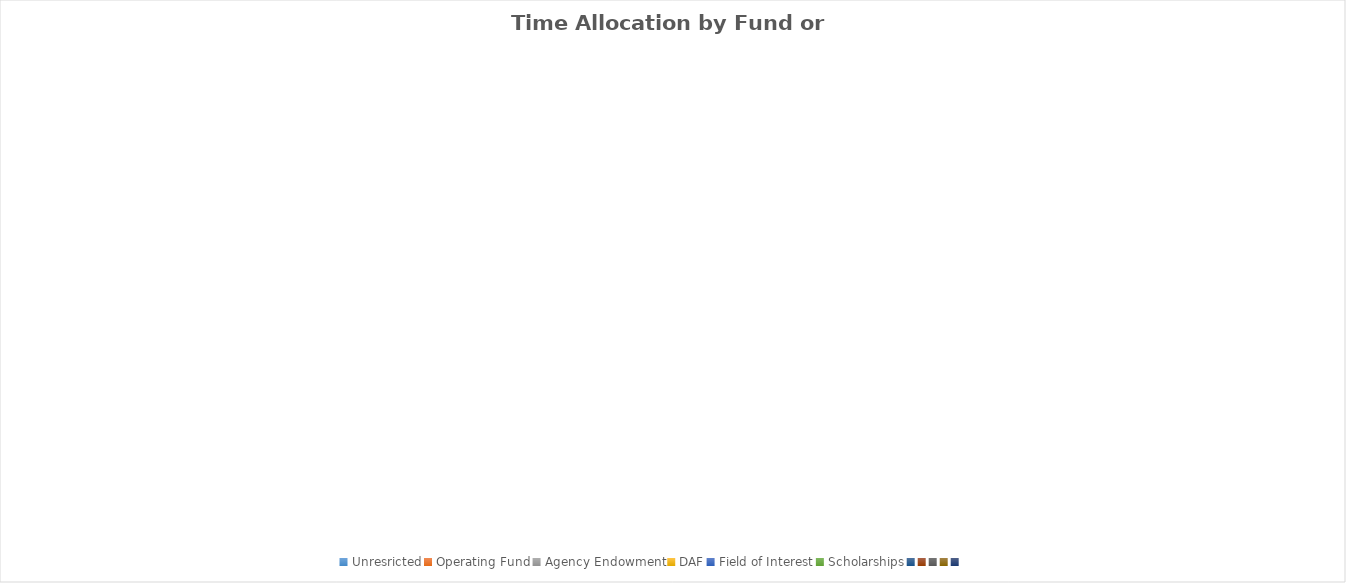
| Category | Time Allocation by Fund or Activity |
|---|---|
| Unresricted | 0 |
| Operating Fund | 0 |
| Agency Endowment | 0 |
| DAF | 0 |
| Field of Interest | 0 |
| Scholarships | 0 |